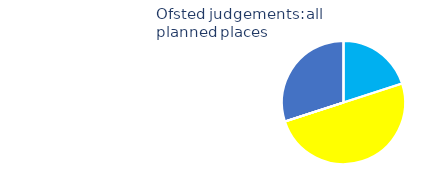
| Category | Series 0 |
|---|---|
| outstanding | 4 |
| good | 10 |
| requires improvement | 0 |
| inadequate | 0 |
| not yet inspected | 6 |
| not inspected by Ofsted | 0 |